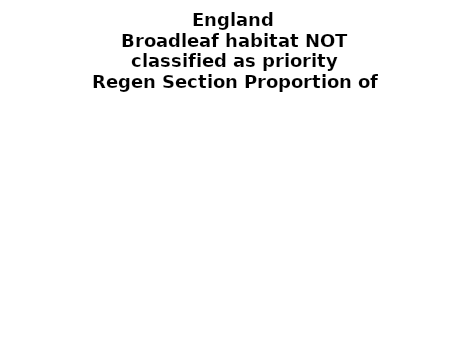
| Category | Broadleaf habitat NOT classified as priority |
|---|---|
| None | 0.233 |
| Seedlings only | 0.002 |
| Seedlings, saplings only | 0.032 |
| Seedlings, saplings, <7 cm trees | 0.043 |
| Saplings only | 0.296 |
| <7 cm trees, seedlings only | 0.001 |
| <7 cm trees, saplings only | 0.218 |
| <7 cm Trees only | 0.174 |